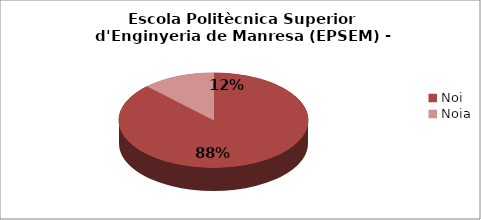
| Category | Escola Politècnica Superior d'Enginyeria de Manresa (EPSEM) - Gènere |
|---|---|
| Noi | 0.876 |
| Noia | 0.124 |